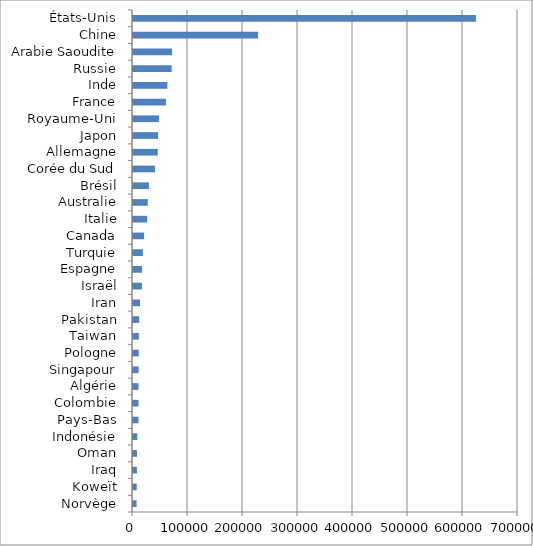
| Category | Series 0 |
|---|---|
| Norvège | 6510 |
| Koweït | 6765.8 |
| Iraq | 7088.2 |
| Oman | 7185.2 |
| Indonésie | 7824.2 |
| Pays-Bas | 9930.8 |
| Colombie | 9966.8 |
| Algérie | 10071.6 |
| Singapour | 10147 |
| Pologne | 10417.6 |
| Taiwan | 10503.6 |
| Pakistan | 11176.8 |
| Iran | 12692.8 |
| Israël | 16226.6 |
| Espagne | 16292.4 |
| Turquie | 17972.8 |
| Canada | 20189.2 |
| Italie | 25748.4 |
| Australie | 26862.6 |
| Brésil | 28854 |
| Corée du Sud | 39876.8 |
| Allemagne | 45028 |
| Japon | 45669 |
| Royaume-Uni | 47410 |
| France | 59845.2 |
| Inde | 62537.4 |
| Russie | 70341.4 |
| Arabie Saoudite | 71034.4 |
| Chine | 227393.8 |
| États-Unis | 623507.6 |